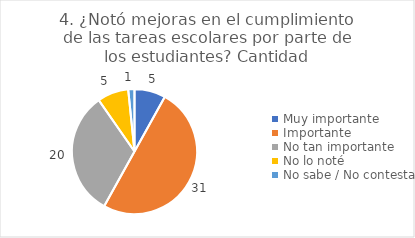
| Category | 4. ¿Notó mejoras en el cumplimiento de las tareas escolares por parte de los estudiantes? |
|---|---|
| Muy importante  | 0.081 |
| Importante  | 0.5 |
| No tan importante  | 0.323 |
| No lo noté  | 0.081 |
| No sabe / No contesta | 0.016 |